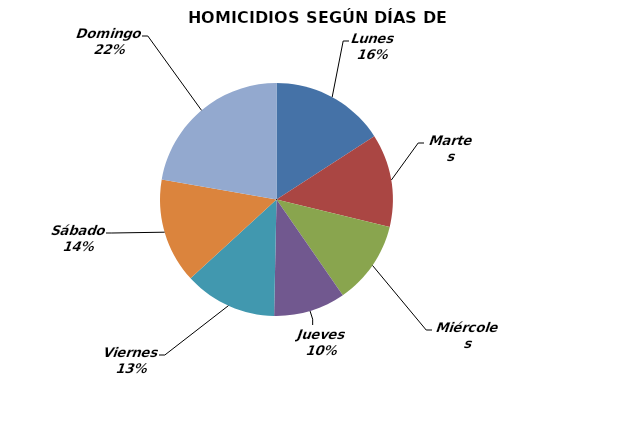
| Category | Series 0 |
|---|---|
| Lunes | 218 |
| Martes | 178 |
| Miércoles | 159 |
| Jueves | 137 |
| Viernes | 177 |
| Sábado | 200 |
| Domingo | 306 |